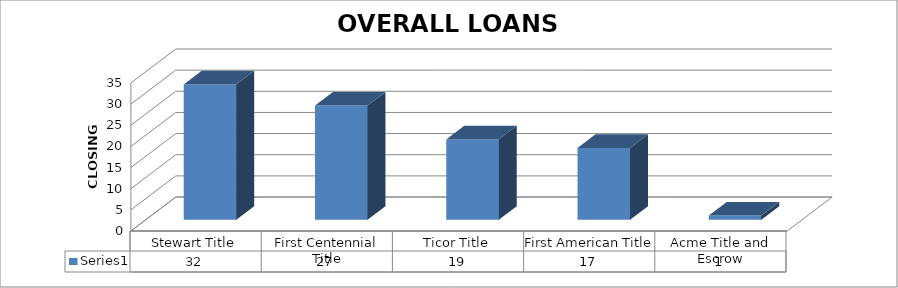
| Category | Series 0 |
|---|---|
| Stewart Title | 32 |
| First Centennial Title | 27 |
| Ticor Title | 19 |
| First American Title | 17 |
| Acme Title and Escrow | 1 |